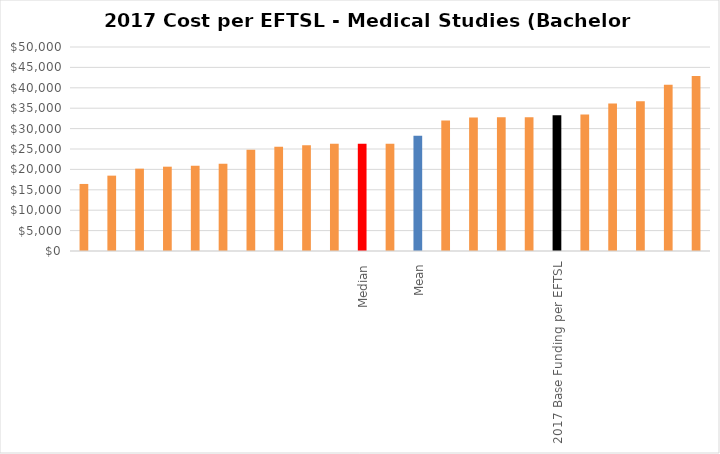
| Category | Series 0 |
|---|---|
|  | 16431.805 |
|  | 18470.158 |
|  | 20182.396 |
|  | 20664.964 |
|  | 20916.164 |
|  | 21415.085 |
|  | 24793.177 |
|  | 25556.242 |
|  | 25902.938 |
|  | 26297.855 |
| Median | 26306 |
|  | 26314.145 |
| Mean | 28255 |
|  | 31989.678 |
|  | 32693.582 |
|  | 32771.262 |
|  | 32785.564 |
| 2017 Base Funding per EFTSL | 33251.322 |